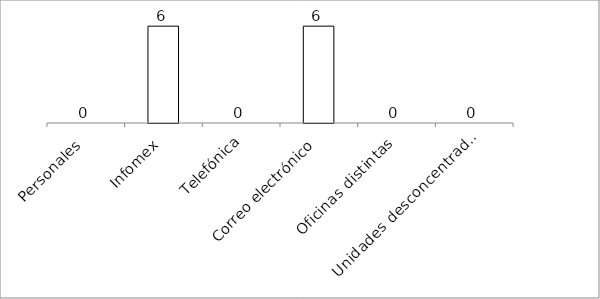
| Category | Series 0 |
|---|---|
| Personales | 0 |
| Infomex | 6 |
| Telefónica | 0 |
| Correo electrónico | 6 |
| Oficinas distintas | 0 |
| Unidades desconcentradas | 0 |